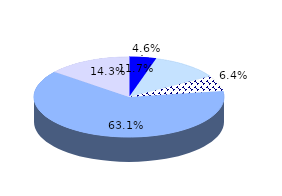
| Category | ESPAÑA |
|---|---|
|     Agricultura | 1051.3 |
|     Industria | 2678.3 |
|     Construcción | 1461.7 |
|     Servicios | 14453 |
|     No clasificable | 3278.1 |